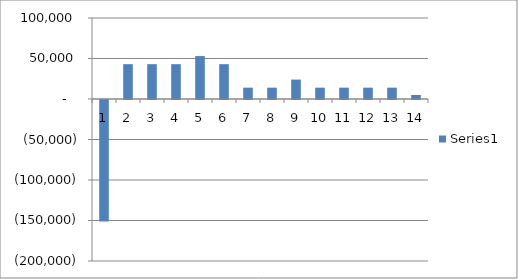
| Category | Series 0 |
|---|---|
| 0 | -150000 |
| 1 | 43000 |
| 2 | 43000 |
| 3 | 43000 |
| 4 | 53000 |
| 5 | 43000 |
| 6 | 14000 |
| 7 | 14000 |
| 8 | 24000 |
| 9 | 14000 |
| 10 | 14000 |
| 11 | 14000 |
| 12 | 14000 |
| 13 | 5000 |